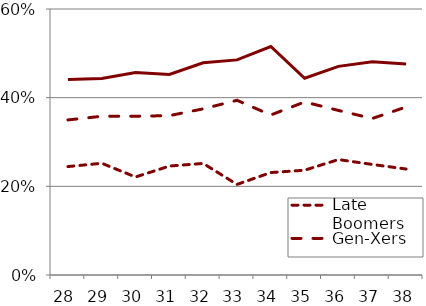
| Category | Late Boomers | Gen-Xers | Millennials |
|---|---|---|---|
| 28.0 | 0.245 | 0.35 | 0.441 |
| 29.0 | 0.252 | 0.358 | 0.443 |
| 30.0 | 0.221 | 0.358 | 0.457 |
| 31.0 | 0.246 | 0.359 | 0.452 |
| 32.0 | 0.252 | 0.375 | 0.479 |
| 33.0 | 0.204 | 0.394 | 0.485 |
| 34.0 | 0.231 | 0.361 | 0.515 |
| 35.0 | 0.236 | 0.39 | 0.444 |
| 36.0 | 0.26 | 0.371 | 0.471 |
| 37.0 | 0.249 | 0.353 | 0.481 |
| 38.0 | 0.239 | 0.379 | 0.476 |